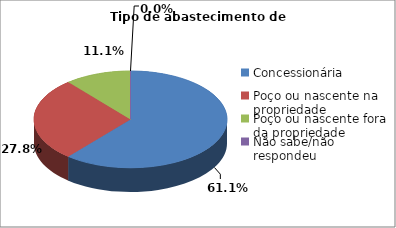
| Category | Series 0 |
|---|---|
| Concessionária | 22 |
| Poço ou nascente na propriedade | 10 |
| Poço ou nascente fora da propriedade | 4 |
| Não sabe/não respondeu | 0 |